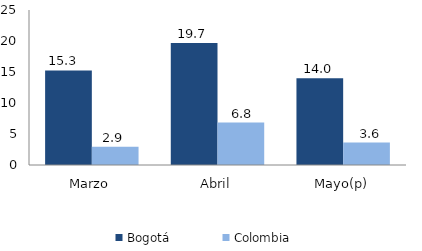
| Category | Bogotá | Colombia |
|---|---|---|
| Marzo | 15.251 | 2.944 |
| Abril | 19.684 | 6.836 |
| Mayo(p) | 14.01 | 3.626 |